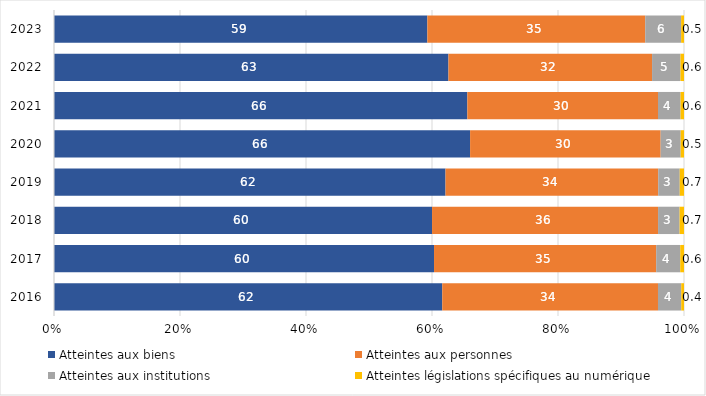
| Category | Atteintes aux biens | Atteintes aux personnes | Atteintes aux institutions | Atteintes législations spécifiques au numérique |
|---|---|---|---|---|
| 2016.0 | 61.627 | 34.245 | 3.689 | 0.439 |
| 2017.0 | 60.322 | 35.264 | 3.817 | 0.598 |
| 2018.0 | 60.007 | 35.874 | 3.421 | 0.698 |
| 2019.0 | 62.146 | 33.759 | 3.42 | 0.675 |
| 2020.0 | 66.047 | 30.249 | 3.174 | 0.531 |
| 2021.0 | 65.611 | 30.263 | 3.575 | 0.55 |
| 2022.0 | 62.611 | 32.319 | 4.513 | 0.557 |
| 2023.0 | 59.265 | 34.581 | 5.698 | 0.456 |